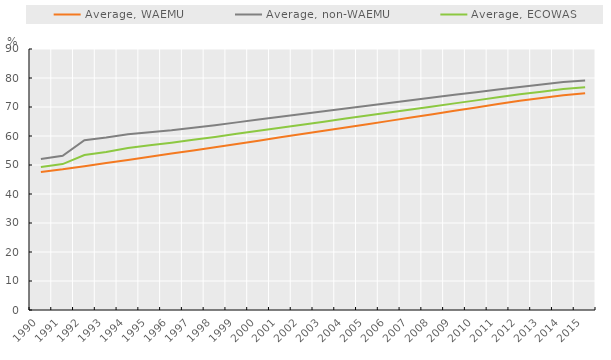
| Category | Average, WAEMU | Average, non-WAEMU | Average, ECOWAS |
|---|---|---|---|
| 1990.0 | 47.588 | 52.06 | 49.308 |
| 1991.0 | 48.5 | 53.2 | 50.308 |
| 1992.0 | 49.588 | 58.567 | 53.436 |
| 1993.0 | 50.662 | 59.5 | 54.45 |
| 1994.0 | 51.75 | 60.629 | 55.893 |
| 1995.0 | 52.85 | 61.329 | 56.807 |
| 1996.0 | 53.938 | 61.986 | 57.693 |
| 1997.0 | 55.038 | 62.843 | 58.68 |
| 1998.0 | 56.15 | 63.714 | 59.68 |
| 1999.0 | 57.275 | 64.7 | 60.74 |
| 2000.0 | 58.4 | 65.671 | 61.793 |
| 2001.0 | 59.55 | 66.614 | 62.847 |
| 2002.0 | 60.662 | 67.6 | 63.9 |
| 2003.0 | 61.788 | 68.543 | 64.94 |
| 2004.0 | 62.938 | 69.514 | 66.007 |
| 2005.0 | 64.062 | 70.457 | 67.047 |
| 2006.0 | 65.213 | 71.4 | 68.1 |
| 2007.0 | 66.375 | 72.314 | 69.147 |
| 2008.0 | 67.525 | 73.257 | 70.2 |
| 2009.0 | 68.688 | 74.186 | 71.253 |
| 2010.0 | 69.838 | 75.086 | 72.287 |
| 2011.0 | 71 | 76.029 | 73.347 |
| 2012.0 | 72.15 | 76.929 | 74.38 |
| 2013.0 | 73.125 | 77.757 | 75.287 |
| 2014.0 | 74.05 | 78.586 | 76.167 |
| 2015.0 | 74.775 | 79.157 | 76.82 |